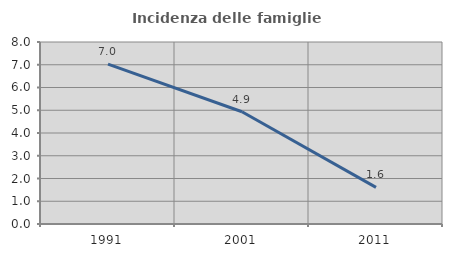
| Category | Incidenza delle famiglie numerose |
|---|---|
| 1991.0 | 7.031 |
| 2001.0 | 4.934 |
| 2011.0 | 1.608 |